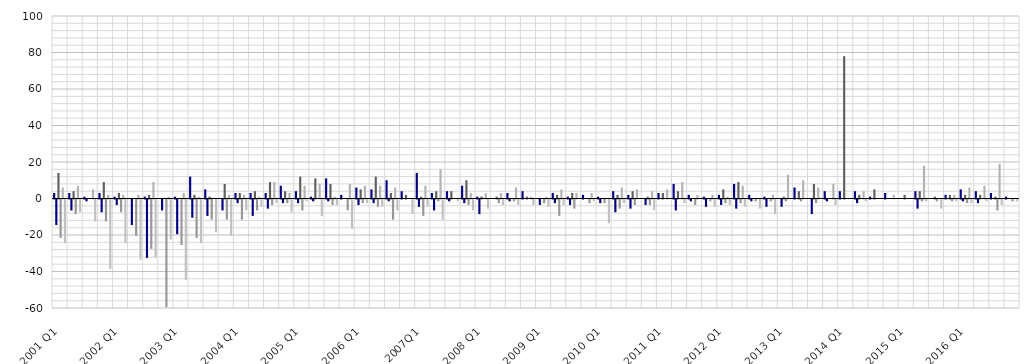
| Category | Fitch (upgrade) | Fitch (downgrade) | Moody's (upgrade) | Moody's (downgrade) | Standard & Poor's (upgrade) | Standard & Poor's (downgrade) |
|---|---|---|---|---|---|---|
| 2001 Q1 | 3 | -14 | 14 | -21 | 6 | -24 |
| 2001 Q2 | 3 | -6 | 4 | -8 | 7 | -7 |
| 2001 Q3 | 1 | -1 | 0 | 0 | 5 | -12 |
| 2001 Q4 | 3 | -7 | 9 | -12 | 2 | -38 |
| 2002 Q1 | 1 | -3 | 3 | -7 | 2 | -24 |
| 2002 Q2 | 0 | -14 | 0 | -20 | 2 | -33 |
| 2002 Q3 | 1 | -32 | 2 | -27 | 9 | -32 |
| 2002 Q4 | 0 | -6 | 0 | -59 | 1 | -22 |
| 2003 Q1 | 1 | -19 | 0 | -25 | 3 | -44 |
| 2003 Q2 | 12 | -10 | 2 | -21 | 1 | -24 |
| 2003 Q3 | 5 | -9 | 1 | -11 | 0 | -18 |
| 2003 Q4 | 0 | -6 | 8 | -11 | 2 | -20 |
| 2004 Q1 | 3 | -2 | 3 | -11 | 2 | -6 |
| 2004 Q2 | 3 | -9 | 4 | -6 | 1 | -4 |
| 2004 Q3 | 3 | -5 | 9 | -3 | 9 | -2 |
| 2004 Q4 | 7 | -2 | 4 | -2 | 3 | -7 |
| 2005 Q1 | 4 | -2 | 12 | -6 | 7 | -1 |
| 2005 Q2 | 1 | -1 | 11 | 0 | 8 | -9 |
| 2005 Q3 | 11 | -1 | 8 | -3 | 1 | -3 |
| 2005 Q4 | 2 | 0 | 0 | -6 | 8 | -16 |
| 2006 Q1 | 6 | -3 | 5 | -2 | 7 | -2 |
| 2006 Q2 | 5 | -2 | 12 | -4 | 7 | -4 |
| 2006 Q3 | 10 | -1 | 3 | -11 | 6 | -6 |
| 2006 Q4 | 4 | 0 | 2 | 0 | 0 | -8 |
| 2007Q1 | 14 | -4 | 1 | -9 | 7 | -4 |
| 2007 Q2 | 3 | -6 | 4 | -1 | 16 | -11 |
| 2007 Q3 | 4 | -1 | 4 | 0 | 0 | -1 |
| 2007 Q4 | 7 | -2 | 10 | -3 | 3 | -6 |
| 2008 Q1 | 1 | -8 | 1 | 0 | 3 | -5 |
| 2008 Q2 | 0 | 0 | 1 | -2 | 3 | -3 |
| 2008 Q3 | 3 | -1 | 0 | -1 | 6 | -3 |
| 2008 Q4 | 4 | 0 | 1 | 0 | 1 | -3 |
| 2009 Q1 | 0 | -3 | 0 | -2 | 1 | -4 |
| 2009 Q2 | 3 | -2 | 2 | -9 | 5 | -3 |
| 2009 Q3 | 1 | -3 | 3 | -5 | 3 | 0 |
| 2009 Q4 | 2 | 0 | 0 | -2 | 3 | -1 |
| 2010 Q1 | 1 | -2 | 0 | -2 | 0 | -13 |
| 2010 Q2 | 4 | -7 | 2 | -5 | 6 | -2 |
| 2010 Q3 | 2 | -5 | 4 | -3 | 5 | 0 |
| 2010 Q4 | 0 | -3 | 1 | -3 | 4 | -6 |
| 2011 Q1 | 3 | 0 | 3 | 0 | 5 | 0 |
| 2011 Q2 | 8 | -6 | 4 | 0 | 9 | -2 |
| 2011 Q3 | 2 | -1 | 0 | -3 | 2 | 0 |
| 2011 Q4 | 1 | -4 | 0 | -1 | 2 | -4 |
| 2012 Q1 | 2 | -3 | 5 | -2 | 1 | -3 |
| 2012 Q2 | 8 | -5 | 9 | -2 | 7 | -4 |
| 2012 Q3 | 2 | -1 | 0 | -1 | 0 | -5 |
| 2012 Q4 | 1 | -4 | 0 | -1 | 2 | -8 |
| 2013 Q1 | 0 | -4 | 1 | -1 | 13 | 0 |
| 2013 Q2 | 6 | 0 | 4 | -1 | 10 | 0 |
| 2013 Q3 | 0 | -8 | 8 | -2 | 6 | 0 |
| 2013 Q4 | 4 | -1 | 0 | 0 | 8 | -3 |
| 2014 Q1 | 4 | 0 | 78 | 0 | 0 | 0 |
| 2014 Q2 | 4 | -2 | 2 | 0 | 4 | -1 |
| 2014 Q3 | 1 | 0 | 5 | 0 | 0 | 0 |
| 2014 Q4 | 3 | 0 | 0 | 0 | 2 | 0 |
| 2015 Q1 | 0 | 0 | 2 | 0 | 0 | 0 |
| 2015 Q2 | 4 | -5 | 4 | -1 | 18 | -1 |
| 2015 Q3 | 0 | 0 | 1 | -1 | 0 | -5 |
| 2015 Q4 | 2 | 0 | 2 | -1 | 2 | -1 |
| 2016 Q1 | 5 | -1 | 2 | -2 | 6 | -2 |
| 2016 Q2 | 4 | -2 | 2 | 0 | 7 | -1 |
| 2016 Q3 | 3 | 0 | 1 | -6 | 19 | -3 |
| 2016 Q4 | 1 | 0 | 0 | -1 | 0 | -1 |